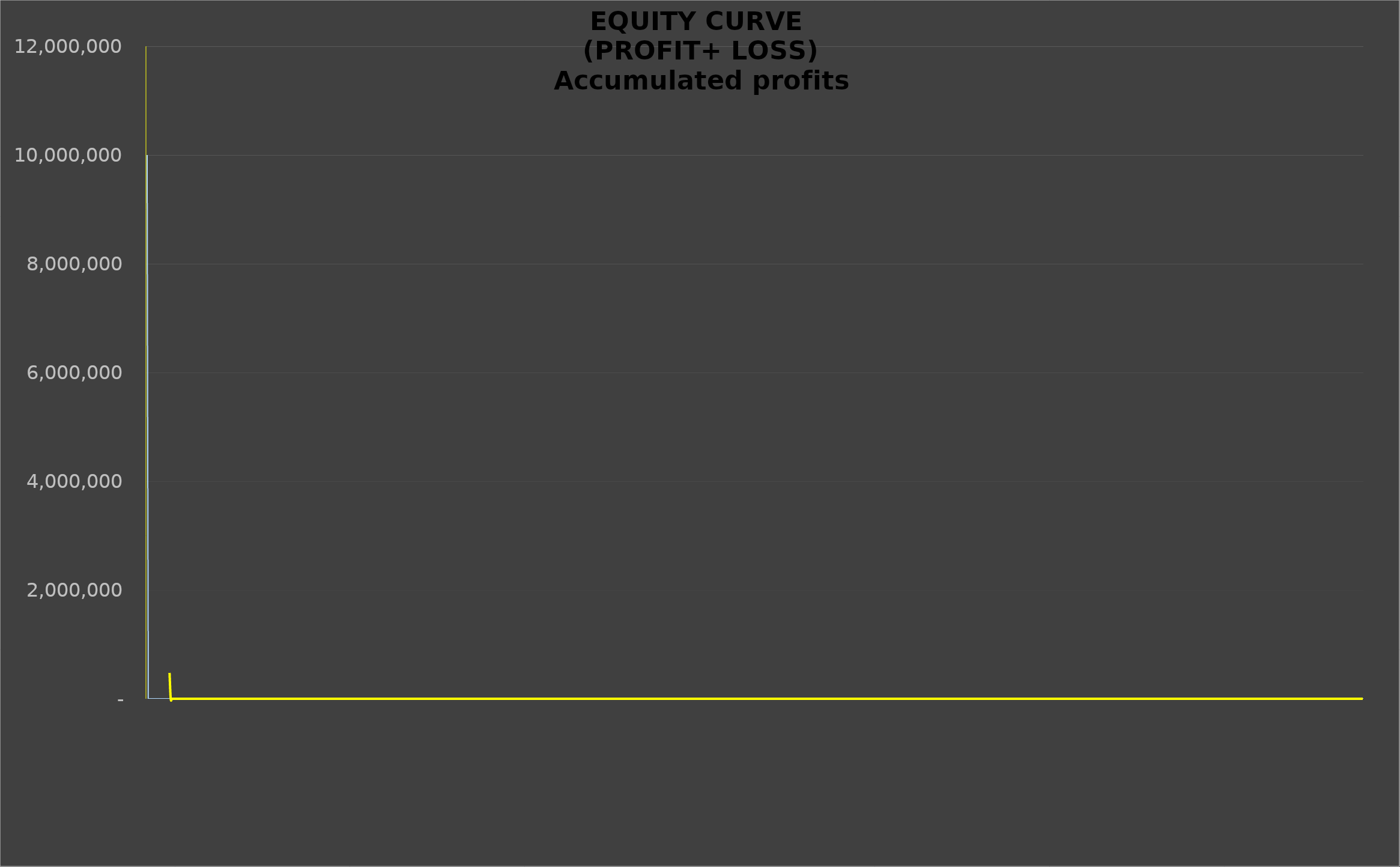
| Category | Acc P% |
|---|---|
|  | 10000000 |
|  | 0 |
|  | 0 |
|  | 0 |
|  | 0 |
|  | 0 |
|  | 0 |
|  | 0 |
|  | 0 |
|  | 0 |
|  | 0 |
|  | 0 |
|  | 0 |
|  | 0 |
|  | 0 |
|  | 0 |
|  | 0 |
|  | 0 |
|  | 0 |
|  | 0 |
|  | 0 |
|  | 0 |
|  | 0 |
|  | 0 |
|  | 0 |
|  | 0 |
|  | 0 |
|  | 0 |
|  | 0 |
|  | 0 |
|  | 0 |
|  | 0 |
|  | 0 |
|  | 0 |
|  | 0 |
|  | 0 |
|  | 0 |
|  | 0 |
|  | 0 |
|  | 0 |
|  | 0 |
|  | 0 |
|  | 0 |
|  | 0 |
|  | 0 |
|  | 0 |
|  | 0 |
|  | 0 |
|  | 0 |
|  | 0 |
|  | 0 |
|  | 0 |
|  | 0 |
|  | 0 |
|  | 0 |
|  | 0 |
|  | 0 |
|  | 0 |
|  | 0 |
|  | 0 |
|  | 0 |
|  | 0 |
|  | 0 |
|  | 0 |
|  | 0 |
|  | 0 |
|  | 0 |
|  | 0 |
|  | 0 |
|  | 0 |
|  | 0 |
|  | 0 |
|  | 0 |
|  | 0 |
|  | 0 |
|  | 0 |
|  | 0 |
|  | 0 |
|  | 0 |
|  | 0 |
|  | 0 |
|  | 0 |
|  | 0 |
|  | 0 |
|  | 0 |
|  | 0 |
|  | 0 |
|  | 0 |
|  | 0 |
|  | 0 |
|  | 0 |
|  | 0 |
|  | 0 |
|  | 0 |
|  | 0 |
|  | 0 |
|  | 0 |
|  | 0 |
|  | 0 |
|  | 0 |
|  | 0 |
|  | 0 |
|  | 0 |
|  | 0 |
|  | 0 |
|  | 0 |
|  | 0 |
|  | 0 |
|  | 0 |
|  | 0 |
|  | 0 |
|  | 0 |
|  | 0 |
|  | 0 |
|  | 0 |
|  | 0 |
|  | 0 |
|  | 0 |
|  | 0 |
|  | 0 |
|  | 0 |
|  | 0 |
|  | 0 |
|  | 0 |
|  | 0 |
|  | 0 |
|  | 0 |
|  | 0 |
|  | 0 |
|  | 0 |
|  | 0 |
|  | 0 |
|  | 0 |
|  | 0 |
|  | 0 |
|  | 0 |
|  | 0 |
|  | 0 |
|  | 0 |
|  | 0 |
|  | 0 |
|  | 0 |
|  | 0 |
|  | 0 |
|  | 0 |
|  | 0 |
|  | 0 |
|  | 0 |
|  | 0 |
|  | 0 |
|  | 0 |
|  | 0 |
|  | 0 |
|  | 0 |
|  | 0 |
|  | 0 |
|  | 0 |
|  | 0 |
|  | 0 |
|  | 0 |
|  | 0 |
|  | 0 |
|  | 0 |
|  | 0 |
|  | 0 |
|  | 0 |
|  | 0 |
|  | 0 |
|  | 0 |
|  | 0 |
|  | 0 |
|  | 0 |
|  | 0 |
|  | 0 |
|  | 0 |
|  | 0 |
|  | 0 |
|  | 0 |
|  | 0 |
|  | 0 |
|  | 0 |
|  | 0 |
|  | 0 |
|  | 0 |
|  | 0 |
|  | 0 |
|  | 0 |
|  | 0 |
|  | 0 |
|  | 0 |
|  | 0 |
|  | 0 |
|  | 0 |
|  | 0 |
|  | 0 |
|  | 0 |
|  | 0 |
|  | 0 |
|  | 0 |
|  | 0 |
|  | 0 |
|  | 0 |
|  | 0 |
|  | 0 |
|  | 0 |
|  | 0 |
|  | 0 |
|  | 0 |
|  | 0 |
|  | 0 |
|  | 0 |
|  | 0 |
|  | 0 |
|  | 0 |
|  | 0 |
|  | 0 |
|  | 0 |
|  | 0 |
|  | 0 |
|  | 0 |
|  | 0 |
|  | 0 |
|  | 0 |
|  | 0 |
|  | 0 |
|  | 0 |
|  | 0 |
|  | 0 |
|  | 0 |
|  | 0 |
|  | 0 |
|  | 0 |
|  | 0 |
|  | 0 |
|  | 0 |
|  | 0 |
|  | 0 |
|  | 0 |
|  | 0 |
|  | 0 |
|  | 0 |
|  | 0 |
|  | 0 |
|  | 0 |
|  | 0 |
|  | 0 |
|  | 0 |
|  | 0 |
|  | 0 |
|  | 0 |
|  | 0 |
|  | 0 |
|  | 0 |
|  | 0 |
|  | 0 |
|  | 0 |
|  | 0 |
|  | 0 |
|  | 0 |
|  | 0 |
|  | 0 |
|  | 0 |
|  | 0 |
|  | 0 |
|  | 0 |
|  | 0 |
|  | 0 |
|  | 0 |
|  | 0 |
|  | 0 |
|  | 0 |
|  | 0 |
|  | 0 |
|  | 0 |
|  | 0 |
|  | 0 |
|  | 0 |
|  | 0 |
|  | 0 |
|  | 0 |
|  | 0 |
|  | 0 |
|  | 0 |
|  | 0 |
|  | 0 |
|  | 0 |
|  | 0 |
|  | 0 |
|  | 0 |
|  | 0 |
|  | 0 |
|  | 0 |
|  | 0 |
|  | 0 |
|  | 0 |
|  | 0 |
|  | 0 |
|  | 0 |
|  | 0 |
|  | 0 |
|  | 0 |
|  | 0 |
|  | 0 |
|  | 0 |
|  | 0 |
|  | 0 |
|  | 0 |
|  | 0 |
|  | 0 |
|  | 0 |
|  | 0 |
|  | 0 |
|  | 0 |
|  | 0 |
|  | 0 |
|  | 0 |
|  | 0 |
|  | 0 |
|  | 0 |
|  | 0 |
|  | 0 |
|  | 0 |
|  | 0 |
|  | 0 |
|  | 0 |
|  | 0 |
|  | 0 |
|  | 0 |
|  | 0 |
|  | 0 |
|  | 0 |
|  | 0 |
|  | 0 |
|  | 0 |
|  | 0 |
|  | 0 |
|  | 0 |
|  | 0 |
|  | 0 |
|  | 0 |
|  | 0 |
|  | 0 |
|  | 0 |
|  | 0 |
|  | 0 |
|  | 0 |
|  | 0 |
|  | 0 |
|  | 0 |
|  | 0 |
|  | 0 |
|  | 0 |
|  | 0 |
|  | 0 |
|  | 0 |
|  | 0 |
|  | 0 |
|  | 0 |
|  | 0 |
|  | 0 |
|  | 0 |
|  | 0 |
|  | 0 |
|  | 0 |
|  | 0 |
|  | 0 |
|  | 0 |
|  | 0 |
|  | 0 |
|  | 0 |
|  | 0 |
|  | 0 |
|  | 0 |
|  | 0 |
|  | 0 |
|  | 0 |
|  | 0 |
|  | 0 |
|  | 0 |
|  | 0 |
|  | 0 |
|  | 0 |
|  | 0 |
|  | 0 |
|  | 0 |
|  | 0 |
|  | 0 |
|  | 0 |
|  | 0 |
|  | 0 |
|  | 0 |
|  | 0 |
|  | 0 |
|  | 0 |
|  | 0 |
|  | 0 |
|  | 0 |
|  | 0 |
|  | 0 |
|  | 0 |
|  | 0 |
|  | 0 |
|  | 0 |
|  | 0 |
|  | 0 |
|  | 0 |
|  | 0 |
|  | 0 |
|  | 0 |
|  | 0 |
|  | 0 |
|  | 0 |
|  | 0 |
|  | 0 |
|  | 0 |
|  | 0 |
|  | 0 |
|  | 0 |
|  | 0 |
|  | 0 |
|  | 0 |
|  | 0 |
|  | 0 |
|  | 0 |
|  | 0 |
|  | 0 |
|  | 0 |
|  | 0 |
|  | 0 |
|  | 0 |
|  | 0 |
|  | 0 |
|  | 0 |
|  | 0 |
|  | 0 |
|  | 0 |
|  | 0 |
|  | 0 |
|  | 0 |
|  | 0 |
|  | 0 |
|  | 0 |
|  | 0 |
|  | 0 |
|  | 0 |
|  | 0 |
|  | 0 |
|  | 0 |
|  | 0 |
|  | 0 |
|  | 0 |
|  | 0 |
|  | 0 |
|  | 0 |
|  | 0 |
|  | 0 |
|  | 0 |
|  | 0 |
|  | 0 |
|  | 0 |
|  | 0 |
|  | 0 |
|  | 0 |
|  | 0 |
|  | 0 |
|  | 0 |
|  | 0 |
|  | 0 |
|  | 0 |
|  | 0 |
|  | 0 |
|  | 0 |
|  | 0 |
|  | 0 |
|  | 0 |
|  | 0 |
|  | 0 |
|  | 0 |
|  | 0 |
|  | 0 |
|  | 0 |
|  | 0 |
|  | 0 |
|  | 0 |
|  | 0 |
|  | 0 |
|  | 0 |
|  | 0 |
|  | 0 |
|  | 0 |
|  | 0 |
|  | 0 |
|  | 0 |
|  | 0 |
|  | 0 |
|  | 0 |
|  | 0 |
|  | 0 |
|  | 0 |
|  | 0 |
|  | 0 |
|  | 0 |
|  | 0 |
|  | 0 |
|  | 0 |
|  | 0 |
|  | 0 |
|  | 0 |
|  | 0 |
|  | 0 |
|  | 0 |
|  | 0 |
|  | 0 |
|  | 0 |
|  | 0 |
|  | 0 |
|  | 0 |
|  | 0 |
|  | 0 |
|  | 0 |
|  | 0 |
|  | 0 |
|  | 0 |
|  | 0 |
|  | 0 |
|  | 0 |
|  | 0 |
|  | 0 |
|  | 0 |
|  | 0 |
|  | 0 |
|  | 0 |
|  | 0 |
|  | 0 |
|  | 0 |
|  | 0 |
|  | 0 |
|  | 0 |
|  | 0 |
|  | 0 |
|  | 0 |
|  | 0 |
|  | 0 |
|  | 0 |
|  | 0 |
|  | 0 |
|  | 0 |
|  | 0 |
|  | 0 |
|  | 0 |
|  | 0 |
|  | 0 |
|  | 0 |
|  | 0 |
|  | 0 |
|  | 0 |
|  | 0 |
|  | 0 |
|  | 0 |
|  | 0 |
|  | 0 |
|  | 0 |
|  | 0 |
|  | 0 |
|  | 0 |
|  | 0 |
|  | 0 |
|  | 0 |
|  | 0 |
|  | 0 |
|  | 0 |
|  | 0 |
|  | 0 |
|  | 0 |
|  | 0 |
|  | 0 |
|  | 0 |
|  | 0 |
|  | 0 |
|  | 0 |
|  | 0 |
|  | 0 |
|  | 0 |
|  | 0 |
|  | 0 |
|  | 0 |
|  | 0 |
|  | 0 |
|  | 0 |
|  | 0 |
|  | 0 |
|  | 0 |
|  | 0 |
|  | 0 |
|  | 0 |
|  | 0 |
|  | 0 |
|  | 0 |
|  | 0 |
|  | 0 |
|  | 0 |
|  | 0 |
|  | 0 |
|  | 0 |
|  | 0 |
|  | 0 |
|  | 0 |
|  | 0 |
|  | 0 |
|  | 0 |
|  | 0 |
|  | 0 |
|  | 0 |
|  | 0 |
|  | 0 |
|  | 0 |
|  | 0 |
|  | 0 |
|  | 0 |
|  | 0 |
|  | 0 |
|  | 0 |
|  | 0 |
|  | 0 |
|  | 0 |
|  | 0 |
|  | 0 |
|  | 0 |
|  | 0 |
|  | 0 |
|  | 0 |
|  | 0 |
|  | 0 |
|  | 0 |
|  | 0 |
|  | 0 |
|  | 0 |
|  | 0 |
|  | 0 |
|  | 0 |
|  | 0 |
|  | 0 |
|  | 0 |
|  | 0 |
|  | 0 |
|  | 0 |
|  | 0 |
|  | 0 |
|  | 0 |
|  | 0 |
|  | 0 |
|  | 0 |
|  | 0 |
|  | 0 |
|  | 0 |
|  | 0 |
|  | 0 |
|  | 0 |
|  | 0 |
|  | 0 |
|  | 0 |
|  | 0 |
|  | 0 |
|  | 0 |
|  | 0 |
|  | 0 |
|  | 0 |
|  | 0 |
|  | 0 |
|  | 0 |
|  | 0 |
|  | 0 |
|  | 0 |
|  | 0 |
|  | 0 |
|  | 0 |
|  | 0 |
|  | 0 |
|  | 0 |
|  | 0 |
|  | 0 |
|  | 0 |
|  | 0 |
|  | 0 |
|  | 0 |
|  | 0 |
|  | 0 |
|  | 0 |
|  | 0 |
|  | 0 |
|  | 0 |
|  | 0 |
|  | 0 |
|  | 0 |
|  | 0 |
|  | 0 |
|  | 0 |
|  | 0 |
|  | 0 |
|  | 0 |
|  | 0 |
|  | 0 |
|  | 0 |
|  | 0 |
|  | 0 |
|  | 0 |
|  | 0 |
|  | 0 |
|  | 0 |
|  | 0 |
|  | 0 |
|  | 0 |
|  | 0 |
|  | 0 |
|  | 0 |
|  | 0 |
|  | 0 |
|  | 0 |
|  | 0 |
|  | 0 |
|  | 0 |
|  | 0 |
|  | 0 |
|  | 0 |
|  | 0 |
|  | 0 |
|  | 0 |
|  | 0 |
|  | 0 |
|  | 0 |
|  | 0 |
|  | 0 |
|  | 0 |
|  | 0 |
|  | 0 |
|  | 0 |
|  | 0 |
|  | 0 |
|  | 0 |
|  | 0 |
|  | 0 |
|  | 0 |
|  | 0 |
|  | 0 |
|  | 0 |
|  | 0 |
|  | 0 |
|  | 0 |
|  | 0 |
|  | 0 |
|  | 0 |
|  | 0 |
|  | 0 |
|  | 0 |
|  | 0 |
|  | 0 |
|  | 0 |
|  | 0 |
|  | 0 |
|  | 0 |
|  | 0 |
|  | 0 |
|  | 0 |
|  | 0 |
|  | 0 |
|  | 0 |
|  | 0 |
|  | 0 |
|  | 0 |
|  | 0 |
|  | 0 |
|  | 0 |
|  | 0 |
|  | 0 |
|  | 0 |
|  | 0 |
|  | 0 |
|  | 0 |
|  | 0 |
|  | 0 |
|  | 0 |
|  | 0 |
|  | 0 |
|  | 0 |
|  | 0 |
|  | 0 |
|  | 0 |
|  | 0 |
|  | 0 |
|  | 0 |
|  | 0 |
|  | 0 |
|  | 0 |
|  | 0 |
|  | 0 |
|  | 0 |
|  | 0 |
|  | 0 |
|  | 0 |
|  | 0 |
|  | 0 |
|  | 0 |
|  | 0 |
|  | 0 |
|  | 0 |
|  | 0 |
|  | 0 |
|  | 0 |
|  | 0 |
|  | 0 |
|  | 0 |
|  | 0 |
|  | 0 |
|  | 0 |
|  | 0 |
|  | 0 |
|  | 0 |
|  | 0 |
|  | 0 |
|  | 0 |
|  | 0 |
|  | 0 |
|  | 0 |
|  | 0 |
|  | 0 |
|  | 0 |
|  | 0 |
|  | 0 |
|  | 0 |
|  | 0 |
|  | 0 |
|  | 0 |
|  | 0 |
|  | 0 |
|  | 0 |
|  | 0 |
|  | 0 |
|  | 0 |
|  | 0 |
|  | 0 |
|  | 0 |
|  | 0 |
|  | 0 |
|  | 0 |
|  | 0 |
|  | 0 |
|  | 0 |
|  | 0 |
|  | 0 |
|  | 0 |
|  | 0 |
|  | 0 |
|  | 0 |
|  | 0 |
|  | 0 |
|  | 0 |
|  | 0 |
|  | 0 |
|  | 0 |
|  | 0 |
|  | 0 |
|  | 0 |
|  | 0 |
|  | 0 |
|  | 0 |
|  | 0 |
|  | 0 |
|  | 0 |
|  | 0 |
|  | 0 |
|  | 0 |
|  | 0 |
|  | 0 |
|  | 0 |
|  | 0 |
|  | 0 |
|  | 0 |
|  | 0 |
|  | 0 |
|  | 0 |
|  | 0 |
|  | 0 |
|  | 0 |
|  | 0 |
|  | 0 |
|  | 0 |
|  | 0 |
|  | 0 |
|  | 0 |
|  | 0 |
|  | 0 |
|  | 0 |
|  | 0 |
|  | 0 |
|  | 0 |
|  | 0 |
|  | 0 |
|  | 0 |
|  | 0 |
|  | 0 |
|  | 0 |
|  | 0 |
|  | 0 |
|  | 0 |
|  | 0 |
|  | 0 |
|  | 0 |
|  | 0 |
|  | 0 |
|  | 0 |
|  | 0 |
|  | 0 |
|  | 0 |
|  | 0 |
|  | 0 |
|  | 0 |
|  | 0 |
|  | 0 |
|  | 0 |
|  | 0 |
|  | 0 |
|  | 0 |
|  | 0 |
|  | 0 |
|  | 0 |
|  | 0 |
|  | 0 |
|  | 0 |
|  | 0 |
|  | 0 |
|  | 0 |
|  | 0 |
|  | 0 |
|  | 0 |
|  | 0 |
|  | 0 |
|  | 0 |
|  | 0 |
|  | 0 |
|  | 0 |
|  | 0 |
|  | 0 |
|  | 0 |
|  | 0 |
|  | 0 |
|  | 0 |
|  | 0 |
|  | 0 |
|  | 0 |
|  | 0 |
|  | 0 |
|  | 0 |
|  | 0 |
|  | 0 |
|  | 0 |
|  | 0 |
|  | 0 |
|  | 0 |
|  | 0 |
|  | 0 |
|  | 0 |
|  | 0 |
|  | 0 |
|  | 0 |
|  | 0 |
|  | 0 |
|  | 0 |
|  | 0 |
|  | 0 |
|  | 0 |
|  | 0 |
|  | 0 |
|  | 0 |
|  | 0 |
|  | 0 |
|  | 0 |
|  | 0 |
|  | 0 |
|  | 0 |
|  | 0 |
|  | 0 |
|  | 0 |
|  | 0 |
|  | 0 |
|  | 0 |
|  | 0 |
|  | 0 |
|  | 0 |
|  | 0 |
|  | 0 |
|  | 0 |
|  | 0 |
|  | 0 |
|  | 0 |
|  | 0 |
|  | 0 |
|  | 0 |
|  | 0 |
|  | 0 |
|  | 0 |
|  | 0 |
|  | 0 |
|  | 0 |
|  | 0 |
|  | 0 |
|  | 0 |
|  | 0 |
|  | 0 |
|  | 0 |
|  | 0 |
|  | 0 |
|  | 0 |
|  | 0 |
|  | 0 |
|  | 0 |
|  | 0 |
|  | 0 |
|  | 0 |
|  | 0 |
|  | 0 |
|  | 0 |
|  | 0 |
|  | 0 |
|  | 0 |
|  | 0 |
|  | 0 |
|  | 0 |
|  | 0 |
|  | 0 |
|  | 0 |
|  | 0 |
|  | 0 |
|  | 0 |
|  | 0 |
|  | 0 |
|  | 0 |
|  | 0 |
|  | 0 |
|  | 0 |
|  | 0 |
|  | 0 |
|  | 0 |
|  | 0 |
|  | 0 |
|  | 0 |
|  | 0 |
|  | 0 |
|  | 0 |
|  | 0 |
|  | 0 |
|  | 0 |
|  | 0 |
|  | 0 |
|  | 0 |
|  | 0 |
|  | 0 |
|  | 0 |